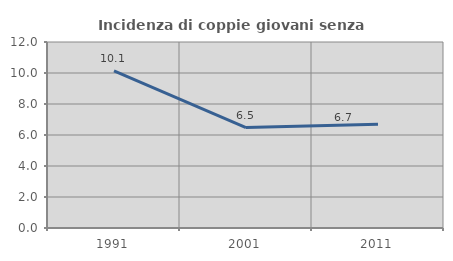
| Category | Incidenza di coppie giovani senza figli |
|---|---|
| 1991.0 | 10.135 |
| 2001.0 | 6.481 |
| 2011.0 | 6.691 |